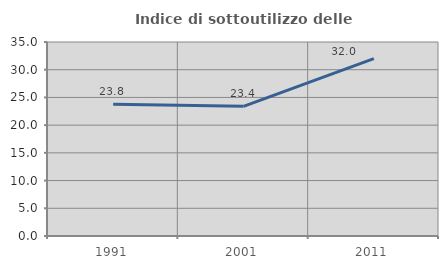
| Category | Indice di sottoutilizzo delle abitazioni  |
|---|---|
| 1991.0 | 23.77 |
| 2001.0 | 23.39 |
| 2011.0 | 32 |